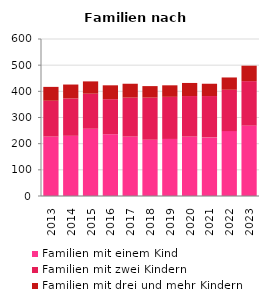
| Category | Familien mit einem Kind | Familien mit zwei Kindern | Familien mit drei und mehr Kindern |
|---|---|---|---|
| 2013.0 | 227 | 137 | 53 |
| 2014.0 | 230 | 143 | 53 |
| 2015.0 | 257 | 134 | 47 |
| 2016.0 | 236 | 134 | 53 |
| 2017.0 | 227 | 149 | 53 |
| 2018.0 | 215 | 161 | 44 |
| 2019.0 | 218 | 161 | 44 |
| 2020.0 | 227 | 155 | 50 |
| 2021.0 | 224 | 158 | 47 |
| 2022.0 | 248 | 158 | 47 |
| 2023.0 | 269 | 170 | 59 |